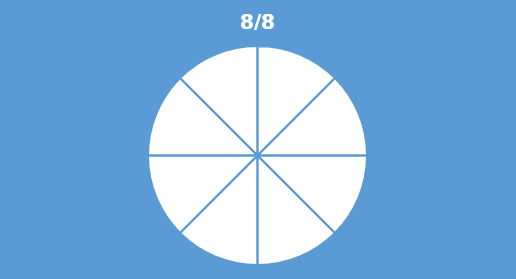
| Category | Series 0 |
|---|---|
| 0 | 0.125 |
| 1 | 0.125 |
| 2 | 0.125 |
| 3 | 0.125 |
| 4 | 0.125 |
| 5 | 0.125 |
| 6 | 0.125 |
| 7 | 0.125 |